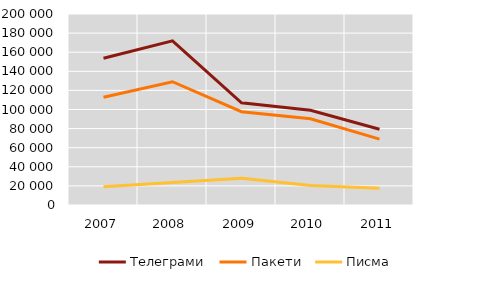
| Category | Писма | Пакети | Телеграми |
|---|---|---|---|
| 2007.0 | 19213 | 93661 | 40872 |
| 2008.0 | 23641 | 105448 | 42745 |
| 2009.0 | 27995 | 69658 | 9391 |
| 2010.0 | 20396 | 69886 | 8952 |
| 2011.0 | 17587 | 51345 | 10441 |